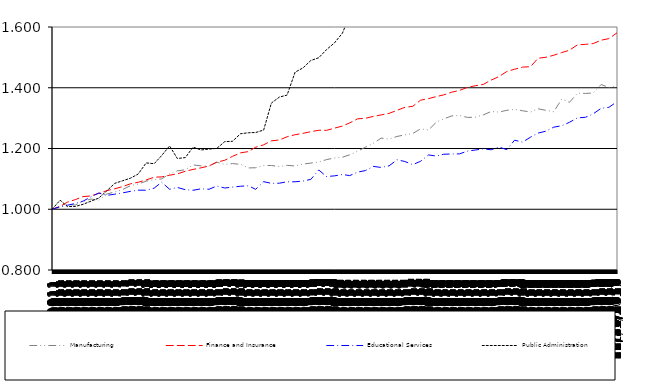
| Category | Series 0 | Manufacturing | Finance and Insurance | Educational Services | Public Administration |
|---|---|---|---|---|---|
| 1/1/11 |  | 1 | 1 | 1 | 1 |
| 2/1/11 |  | 1.006 | 1.009 | 1.009 | 1.03 |
| 3/1/11 |  | 1.016 | 1.023 | 1.013 | 1.009 |
| 4/1/11 |  | 1.014 | 1.032 | 1.019 | 1.009 |
| 5/1/11 |  | 1.026 | 1.042 | 1.027 | 1.016 |
| 6/1/11 |  | 1.034 | 1.044 | 1.041 | 1.027 |
| 7/1/11 |  | 1.03 | 1.052 | 1.053 | 1.037 |
| 8/1/11 |  | 1.05 | 1.061 | 1.046 | 1.06 |
| 9/1/11 |  | 1.057 | 1.067 | 1.05 | 1.085 |
| 10/1/11 |  | 1.065 | 1.074 | 1.054 | 1.094 |
| 11/1/11 |  | 1.078 | 1.084 | 1.059 | 1.102 |
| 12/1/11 |  | 1.083 | 1.089 | 1.063 | 1.116 |
| 1/1/12 |  | 1.093 | 1.096 | 1.063 | 1.153 |
| 2/1/12 |  | 1.098 | 1.106 | 1.069 | 1.15 |
| 3/1/12 |  | 1.1 | 1.106 | 1.089 | 1.177 |
| 4/1/12 |  | 1.117 | 1.112 | 1.066 | 1.209 |
| 5/1/12 |  | 1.126 | 1.117 | 1.072 | 1.167 |
| 6/1/12 |  | 1.13 | 1.125 | 1.064 | 1.17 |
| 7/1/12 |  | 1.146 | 1.131 | 1.062 | 1.204 |
| 8/1/12 |  | 1.143 | 1.136 | 1.067 | 1.195 |
| 9/1/12 |  | 1.142 | 1.143 | 1.066 | 1.198 |
| 10/1/12 |  | 1.155 | 1.155 | 1.076 | 1.2 |
| 11/1/12 |  | 1.148 | 1.161 | 1.07 | 1.223 |
| 12/1/12 |  | 1.15 | 1.174 | 1.073 | 1.224 |
| 1/1/13 |  | 1.148 | 1.186 | 1.076 | 1.249 |
| 2/1/13 |  | 1.136 | 1.19 | 1.077 | 1.252 |
| 3/1/13 |  | 1.137 | 1.204 | 1.066 | 1.253 |
| 4/1/13 |  | 1.144 | 1.212 | 1.091 | 1.261 |
| 5/1/13 |  | 1.144 | 1.225 | 1.085 | 1.35 |
| 6/1/13 |  | 1.14 | 1.228 | 1.086 | 1.369 |
| 7/1/13 |  | 1.145 | 1.239 | 1.091 | 1.376 |
| 8/1/13 |  | 1.143 | 1.245 | 1.09 | 1.451 |
| 9/1/13 |  | 1.149 | 1.25 | 1.093 | 1.466 |
| 10/1/13 |  | 1.152 | 1.255 | 1.098 | 1.49 |
| 11/1/13 |  | 1.155 | 1.26 | 1.129 | 1.499 |
| 12/1/13 |  | 1.163 | 1.26 | 1.108 | 1.526 |
| 1/1/14 |  | 1.169 | 1.267 | 1.11 | 1.548 |
| 2/1/14 |  | 1.171 | 1.274 | 1.114 | 1.58 |
| 3/1/14 |  | 1.179 | 1.284 | 1.111 | 1.639 |
| 4/1/14 |  | 1.191 | 1.298 | 1.122 | 1.644 |
| 5/1/14 |  | 1.204 | 1.299 | 1.127 | 1.717 |
| 6/1/14 |  | 1.217 | 1.306 | 1.141 | 1.739 |
| 7/1/14 |  | 1.234 | 1.311 | 1.138 | 1.734 |
| 8/1/14 |  | 1.231 | 1.316 | 1.143 | 1.709 |
| 9/1/14 |  | 1.24 | 1.326 | 1.163 | 1.719 |
| 10/1/14 |  | 1.245 | 1.335 | 1.157 | 1.749 |
| 11/1/14 |  | 1.25 | 1.339 | 1.147 | 1.777 |
| 12/1/14 |  | 1.264 | 1.359 | 1.158 | 1.857 |
| 1/1/15 |  | 1.261 | 1.364 | 1.179 | 1.953 |
| 2/1/15 |  | 1.287 | 1.371 | 1.175 | 2.024 |
| 3/1/15 |  | 1.297 | 1.377 | 1.181 | 2.064 |
| 4/1/15 |  | 1.307 | 1.385 | 1.182 | 2.158 |
| 5/1/15 |  | 1.309 | 1.391 | 1.182 | 2.126 |
| 6/1/15 |  | 1.302 | 1.401 | 1.191 | 2.049 |
| 7/1/15 |  | 1.303 | 1.406 | 1.195 | 2.087 |
| 8/1/15 |  | 1.31 | 1.411 | 1.199 | 2.131 |
| 9/1/15 |  | 1.322 | 1.425 | 1.196 | 2.177 |
| 10/1/15 |  | 1.32 | 1.437 | 1.205 | 2.177 |
| 11/1/15 |  | 1.326 | 1.454 | 1.196 | 2.23 |
| 12/1/15 |  | 1.329 | 1.461 | 1.227 | 2.263 |
| 1/1/16 |  | 1.324 | 1.468 | 1.221 | 2.323 |
| 2/1/16 |  | 1.32 | 1.469 | 1.237 | 2.349 |
| 3/1/16 |  | 1.331 | 1.497 | 1.251 | 2.428 |
| 4/1/16 |  | 1.326 | 1.5 | 1.257 | 2.456 |
| 5/1/16 |  | 1.321 | 1.507 | 1.27 | 2.563 |
| 6/1/16 |  | 1.363 | 1.516 | 1.275 | 2.735 |
| 7/1/16 |  | 1.352 | 1.523 | 1.286 | 2.806 |
| 8/1/16 |  | 1.382 | 1.541 | 1.301 | 2.877 |
| 9/1/16 |  | 1.381 | 1.543 | 1.303 | 2.944 |
| 10/1/16 |  | 1.383 | 1.545 | 1.314 | 3.084 |
| 11/1/16 |  | 1.411 | 1.557 | 1.332 | 3.442 |
| 12/1/16 |  | 1.401 | 1.562 | 1.336 | 3.094 |
| 1/1/17 |  | 1.406 | 1.58 | 1.354 | 2.981 |